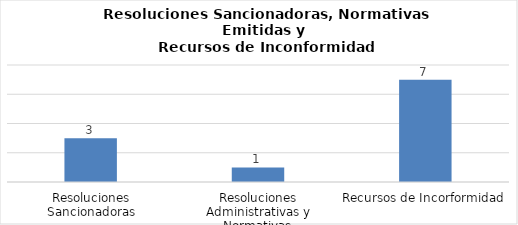
| Category | Series 0 |
|---|---|
| Resoluciones Sancionadoras | 3 |
| Resoluciones Administrativas y Normativas | 1 |
| Recursos de Incorformidad | 7 |